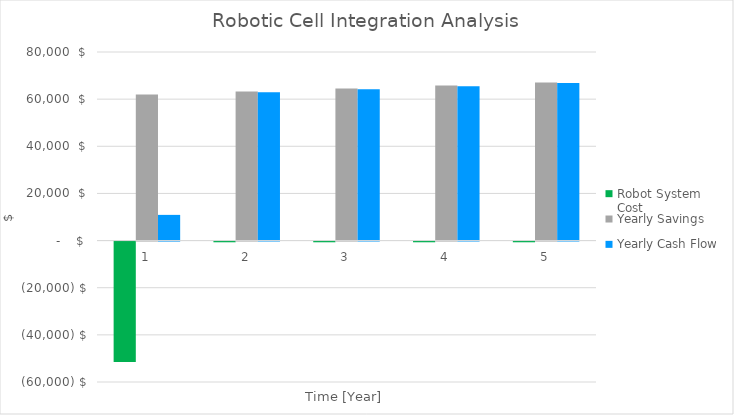
| Category | Robot System Cost | Yearly Savings | Yearly Cash Flow |
|---|---|---|---|
| 0 | -51100 | 62000 | 10900 |
| 1 | -300 | 63240 | 62940 |
| 2 | -300 | 64504.8 | 64204.8 |
| 3 | -300 | 65794.896 | 65494.896 |
| 4 | -300 | 67110.794 | 66810.794 |